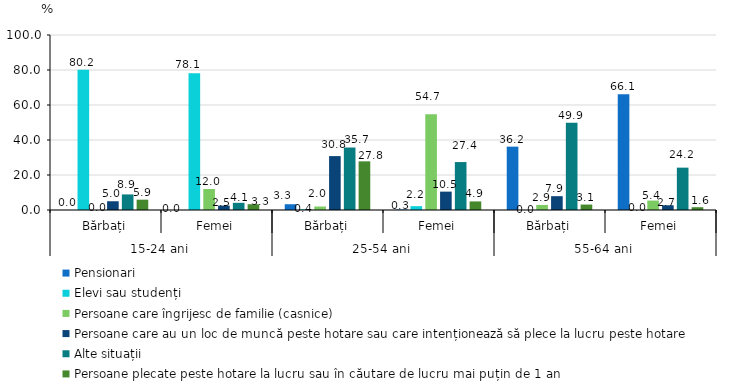
| Category | Pensionari | Elevi sau studenți | Persoane care îngrijesc de familie (casnice) | Persoane care au un loc de muncă peste hotare sau care intenționează să plece la lucru peste hotare | Alte situații | Persoane plecate peste hotare la lucru sau în căutare de lucru mai puțin de 1 an |
|---|---|---|---|---|---|---|
| 0 | 0 | 80.2 | 0 | 5 | 8.9 | 5.9 |
| 1 | 0 | 78.1 | 12 | 2.5 | 4.1 | 3.3 |
| 2 | 3.3 | 0.4 | 2 | 30.8 | 35.7 | 27.8 |
| 3 | 0.3 | 2.2 | 54.7 | 10.5 | 27.4 | 4.9 |
| 4 | 36.2 | 0 | 2.9 | 7.9 | 49.9 | 3.1 |
| 5 | 66.1 | 0 | 5.4 | 2.7 | 24.2 | 1.6 |